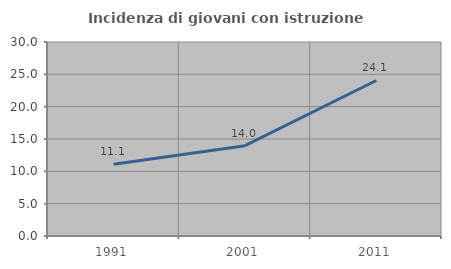
| Category | Incidenza di giovani con istruzione universitaria |
|---|---|
| 1991.0 | 11.111 |
| 2001.0 | 13.971 |
| 2011.0 | 24.051 |